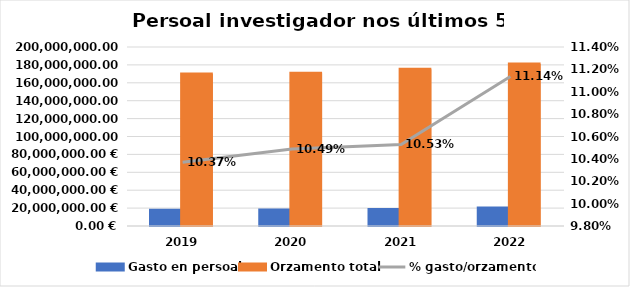
| Category | Gasto en persoal | Orzamento total |
|---|---|---|
| 2019.0 | 17600789.84 | 169720733.3 |
| 2020.0 | 17900266.91 | 170681126.09 |
| 2021.0 | 18438960.2 | 175131206.4 |
| 2022.0 | 20155107.82 | 180980048.67 |